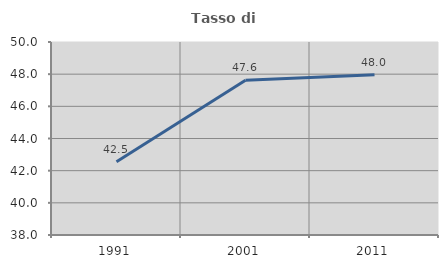
| Category | Tasso di occupazione   |
|---|---|
| 1991.0 | 42.55 |
| 2001.0 | 47.619 |
| 2011.0 | 47.958 |